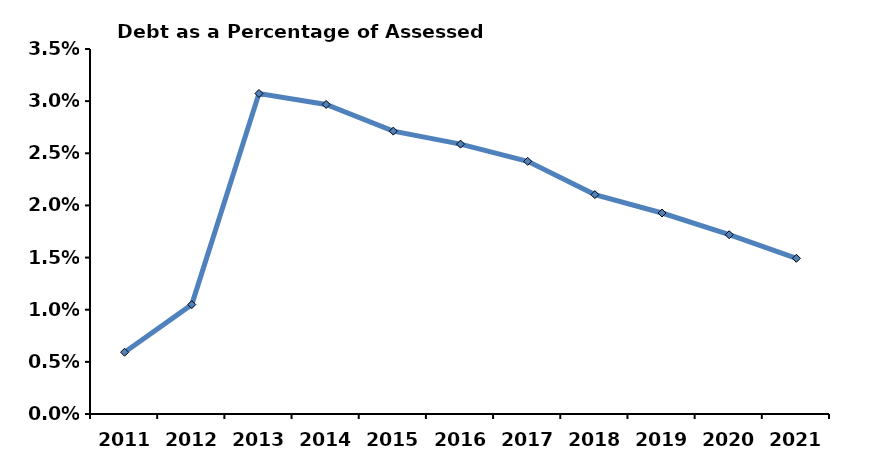
| Category | As % assessed valuation |
|---|---|
| 2011.0 | 0.006 |
| 2012.0 | 0.01 |
| 2013.0 | 0.031 |
| 2014.0 | 0.03 |
| 2015.0 | 0.027 |
| 2016.0 | 0.026 |
| 2017.0 | 0.024 |
| 2018.0 | 0.021 |
| 2019.0 | 0.019 |
| 2020.0 | 0.017 |
| 2021.0 | 0.015 |